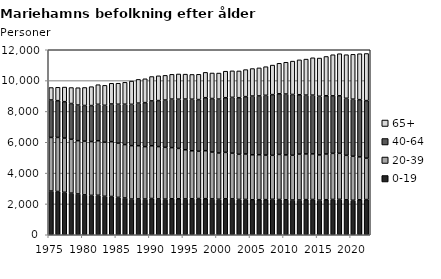
| Category | 0-19 | 20-39 | 40-64 | 65+ |
|---|---|---|---|---|
| 1975.0 | 2835 | 3478 | 2428 | 809 |
| 1976.0 | 2806 | 3508 | 2384 | 868 |
| 1977.0 | 2755 | 3517 | 2361 | 946 |
| 1978.0 | 2700 | 3494 | 2319 | 1037 |
| 1979.0 | 2648 | 3456 | 2311 | 1123 |
| 1980.0 | 2588 | 3483 | 2313 | 1169 |
| 1981.0 | 2555 | 3491 | 2334 | 1226 |
| 1982.0 | 2562 | 3538 | 2362 | 1271 |
| 1983.0 | 2497 | 3505 | 2394 | 1295 |
| 1984.0 | 2483 | 3554 | 2447 | 1340 |
| 1985.0 | 2426 | 3515 | 2525 | 1363 |
| 1986.0 | 2385 | 3464 | 2619 | 1420 |
| 1987.0 | 2315 | 3466 | 2679 | 1506 |
| 1988.0 | 2327 | 3450 | 2762 | 1538 |
| 1989.0 | 2317 | 3400 | 2853 | 1547 |
| 1990.0 | 2351 | 3424 | 2907 | 1581 |
| 1991.0 | 2327 | 3393 | 2984 | 1606 |
| 1992.0 | 2312 | 3359 | 3067 | 1600 |
| 1993.0 | 2333 | 3320 | 3147 | 1606 |
| 1994.0 | 2335 | 3267 | 3192 | 1635 |
| 1995.0 | 2323 | 3191 | 3288 | 1616 |
| 1996.0 | 2330 | 3118 | 3345 | 1606 |
| 1997.0 | 2348 | 3070 | 3351 | 1639 |
| 1998.0 | 2340 | 3112 | 3438 | 1644 |
| 1999.0 | 2324 | 3042 | 3470 | 1656 |
| 2000.0 | 2304 | 2999 | 3498 | 1687 |
| 2001.0 | 2331 | 3014 | 3544 | 1720 |
| 2002.0 | 2326 | 2967 | 3619 | 1720 |
| 2003.0 | 2294 | 2926 | 3670 | 1736 |
| 2004.0 | 2293 | 2946 | 3720 | 1753 |
| 2005.0 | 2267 | 2921 | 3808 | 1784 |
| 2006.0 | 2276 | 2917 | 3813 | 1818 |
| 2007.0 | 2279 | 2889 | 3876 | 1858 |
| 2008.0 | 2300 | 2854 | 3936 | 1915 |
| 2009.0 | 2287 | 2925 | 3932 | 1979 |
| 2010.0 | 2267 | 2913 | 3948 | 2062 |
| 2011.0 | 2253 | 2906 | 3941 | 2163 |
| 2012.0 | 2255 | 2978 | 3850 | 2263 |
| 2013.0 | 2279 | 2963 | 3816 | 2335 |
| 2014.0 | 2288 | 2959 | 3810 | 2423 |
| 2015.0 | 2246 | 2935 | 3803 | 2477 |
| 2016.0 | 2273 | 2965 | 3779 | 2548 |
| 2017.0 | 2291 | 2989 | 3731 | 2666 |
| 2018.0 | 2298 | 2986 | 3728 | 2731 |
| 2019.0 | 2266 | 2887 | 3699 | 2827 |
| 2020.0 | 2236 | 2859 | 3700 | 2910 |
| 2021.0 | 2269 | 2784 | 3710 | 2979 |
| 2022.0 | 2283 | 2686 | 3733 | 3055 |